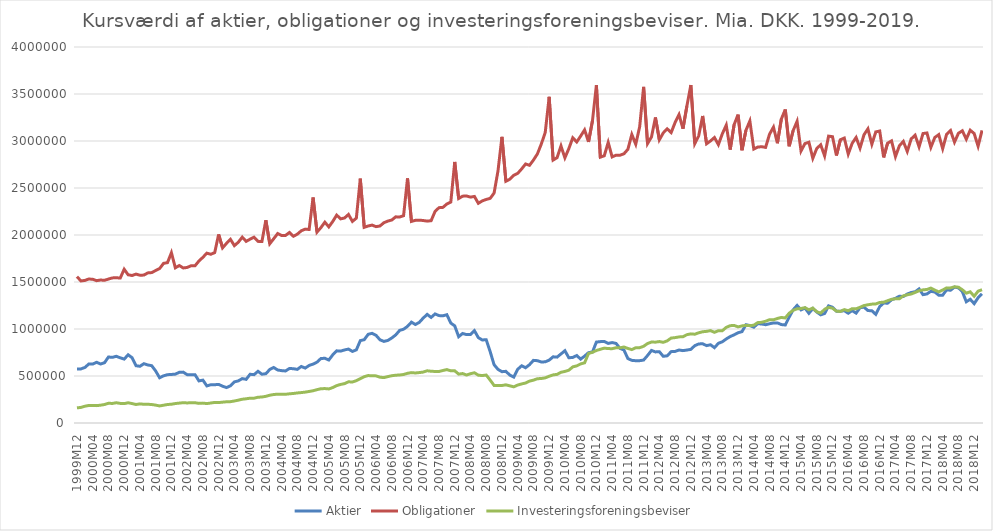
| Category | Aktier | Obligationer | Investeringsforeningsbeviser |
|---|---|---|---|
| 1999M12 | 575174 | 1557344 | 160748 |
| 2000M01 | 575647 | 1511391 | 165778 |
| 2000M02 | 590162 | 1516681 | 178351 |
| 2000M03 | 627205 | 1531792 | 186450 |
| 2000M04 | 627098 | 1528959 | 185941 |
| 2000M05 | 645738 | 1514125 | 184746 |
| 2000M06 | 627336 | 1521104 | 189451 |
| 2000M07 | 641242 | 1517881 | 196711 |
| 2000M08 | 702030 | 1531576 | 209725 |
| 2000M09 | 698497 | 1543590 | 208058 |
| 2000M10 | 709608 | 1545110 | 215514 |
| 2000M11 | 693340 | 1542126 | 208436 |
| 2000M12 | 679721 | 1635693 | 206347 |
| 2001M01 | 725587 | 1576917 | 214998 |
| 2001M02 | 694857 | 1569066 | 206745 |
| 2001M03 | 609401 | 1583968 | 196955 |
| 2001M04 | 603191 | 1572117 | 203492 |
| 2001M05 | 630929 | 1573534 | 198988 |
| 2001M06 | 617507 | 1596730 | 199211 |
| 2001M07 | 609553 | 1600137 | 196654 |
| 2001M08 | 553257 | 1622133 | 190230 |
| 2001M09 | 481246 | 1642834 | 181861 |
| 2001M10 | 501680 | 1698473 | 188909 |
| 2001M11 | 513948 | 1705760 | 196822 |
| 2001M12 | 516411 | 1811508 | 199644 |
| 2002M01 | 519822 | 1650899 | 207163 |
| 2002M02 | 539138 | 1675130 | 211558 |
| 2002M03 | 541132 | 1649367 | 216023 |
| 2002M04 | 514315 | 1654759 | 213580 |
| 2002M05 | 513817 | 1672767 | 215308 |
| 2002M06 | 513817 | 1672767 | 215308 |
| 2002M07 | 447539 | 1723382 | 208760 |
| 2002M08 | 456303 | 1762651 | 211579 |
| 2002M09 | 394395 | 1806730 | 206568 |
| 2002M10 | 406663 | 1795063 | 212548 |
| 2002M11 | 407258 | 1812469 | 219093 |
| 2002M12 | 410511 | 2006227 | 217309 |
| 2003M01 | 391549 | 1863047 | 221673 |
| 2003M02 | 376802 | 1911051 | 225702 |
| 2003M03 | 395690 | 1954134 | 227024 |
| 2003M04 | 437489 | 1886932 | 234152 |
| 2003M05 | 448094 | 1922970 | 242874 |
| 2003M06 | 472372 | 1977111 | 253018 |
| 2003M07 | 464487 | 1932479 | 257571 |
| 2003M08 | 518497 | 1955701 | 264121 |
| 2003M09 | 514394 | 1976613 | 263728 |
| 2003M10 | 549719 | 1932259 | 274176 |
| 2003M11 | 518793 | 1930731 | 276357 |
| 2003M12 | 524264 | 2157438 | 283847 |
| 2004M01 | 569517 | 1907331 | 295540 |
| 2004M02 | 590348 | 1960377 | 302996 |
| 2004M03 | 563873 | 2015258 | 306728 |
| 2004M04 | 557087 | 1994459 | 304884 |
| 2004M05 | 553644 | 1995813 | 305509 |
| 2004M06 | 579982 | 2026560 | 310671 |
| 2004M07 | 577582 | 1986508 | 314125 |
| 2004M08 | 570687 | 2008771 | 319660 |
| 2004M09 | 601262 | 2044870 | 323707 |
| 2004M10 | 584594 | 2062475 | 328383 |
| 2004M11 | 612471 | 2058625 | 335384 |
| 2004M12 | 626287 | 2399007 | 343144 |
| 2005M01 | 647568 | 2030789 | 354733 |
| 2005M02 | 686066 | 2079000 | 364640 |
| 2005M03 | 688607 | 2136473 | 366253 |
| 2005M04 | 670048 | 2086332 | 362498 |
| 2005M05 | 725046 | 2143882 | 376826 |
| 2005M06 | 767618 | 2211582 | 397766 |
| 2005M07 | 764645 | 2171839 | 410469 |
| 2005M08 | 777319 | 2181082 | 418972 |
| 2005M09 | 786332 | 2218467 | 438329 |
| 2005M10 | 761261 | 2144434 | 436105 |
| 2005M11 | 777998 | 2179472 | 450288 |
| 2005M12 | 876163 | 2599662 | 471850 |
| 2006M01 | 886363 | 2081826 | 492881 |
| 2006M02 | 943407 | 2096086 | 504632 |
| 2006M03 | 953835 | 2105200 | 502265 |
| 2006M04 | 932787 | 2088709 | 501263 |
| 2006M05 | 885160 | 2096140 | 487065 |
| 2006M06 | 868076 | 2130715 | 482889 |
| 2006M07 | 878239 | 2147943 | 493746 |
| 2006M08 | 904551 | 2159636 | 503033 |
| 2006M09 | 936797 | 2193171 | 508286 |
| 2006M10 | 984872 | 2191238 | 510813 |
| 2006M11 | 997962 | 2205316 | 516009 |
| 2006M12 | 1027930 | 2602178 | 528614 |
| 2007M01 | 1072939 | 2144428 | 535917 |
| 2007M02 | 1047612 | 2156160 | 532186 |
| 2007M03 | 1070763 | 2158080 | 536508 |
| 2007M04 | 1116896 | 2153997 | 541713 |
| 2007M05 | 1155385 | 2147554 | 555614 |
| 2007M06 | 1123217 | 2152316 | 550464 |
| 2007M07 | 1160422 | 2250769 | 548335 |
| 2007M08 | 1142552 | 2290712 | 547958 |
| 2007M09 | 1140519 | 2293926 | 558609 |
| 2007M10 | 1151802 | 2330081 | 568203 |
| 2007M11 | 1063171 | 2350492 | 555042 |
| 2007M12 | 1033177 | 2777086 | 555003 |
| 2008M01 | 918225 | 2388301 | 520054 |
| 2008M02 | 952377 | 2413171 | 526022 |
| 2008M03 | 940197 | 2415065 | 510069 |
| 2008M04 | 941535 | 2403112 | 524526 |
| 2008M05 | 982089 | 2410140 | 534425 |
| 2008M06 | 908343 | 2337160 | 508793 |
| 2008M07 | 883307 | 2362838 | 504650 |
| 2008M08 | 886096 | 2378275 | 510319 |
| 2008M09 | 759950 | 2389665 | 456584 |
| 2008M10 | 620008 | 2445823 | 399629 |
| 2008M11 | 570116 | 2683893 | 397576 |
| 2008M12 | 545871 | 3044262 | 398958 |
| 2009M01 | 549715 | 2571659 | 405919 |
| 2009M02 | 509245 | 2593509 | 395518 |
| 2009M03 | 488425 | 2634439 | 384809 |
| 2009M04 | 571307 | 2655599 | 403575 |
| 2009M05 | 608507 | 2702649 | 415678 |
| 2009M06 | 587808 | 2755471 | 425281 |
| 2009M07 | 620395 | 2741454 | 445444 |
| 2009M08 | 666249 | 2797081 | 455808 |
| 2009M09 | 662900 | 2862025 | 471255 |
| 2009M10 | 649205 | 2967408 | 473076 |
| 2009M11 | 650795 | 3091417 | 480443 |
| 2009M12 | 668987 | 3470399 | 497313 |
| 2010M01 | 704145 | 2797013 | 511840 |
| 2010M02 | 700775 | 2822479 | 517108 |
| 2010M03 | 734573 | 2947573 | 539561 |
| 2010M04 | 768999 | 2821624 | 548623 |
| 2010M05 | 693852 | 2919512 | 561939 |
| 2010M06 | 697532 | 3034452 | 597185 |
| 2010M07 | 717785 | 2989715 | 607574 |
| 2010M08 | 679719 | 3052346 | 628490 |
| 2010M09 | 711815 | 3118357 | 640203 |
| 2010M10 | 748166 | 2990379 | 739615 |
| 2010M11 | 755357 | 3214863 | 752164 |
| 2010M12 | 860927 | 3594134 | 771586 |
| 2011M01 | 865634 | 2827974 | 784306 |
| 2011M02 | 868103 | 2842919 | 796417 |
| 2011M03 | 846852 | 2985437 | 791657 |
| 2011M04 | 855641 | 2831028 | 790599 |
| 2011M05 | 846467 | 2849098 | 800536 |
| 2011M06 | 793880 | 2848803 | 799381 |
| 2011M07 | 776121 | 2864109 | 808539 |
| 2011M08 | 685664 | 2911356 | 793058 |
| 2011M09 | 666474 | 3069425 | 781106 |
| 2011M10 | 662567 | 2965332 | 800475 |
| 2011M11 | 663050 | 3152146 | 801234 |
| 2011M12 | 669523 | 3576010 | 816113 |
| 2012M01 | 718139 | 2973050 | 845524 |
| 2012M02 | 771891 | 3043339 | 861101 |
| 2012M03 | 756309 | 3250779 | 860080 |
| 2012M04 | 758267 | 3012721 | 866469 |
| 2012M05 | 709421 | 3086802 | 858201 |
| 2012M06 | 715047 | 3129053 | 874065 |
| 2012M07 | 759130 | 3089635 | 903626 |
| 2012M08 | 761567 | 3196643 | 908313 |
| 2012M09 | 776340 | 3280142 | 915947 |
| 2012M10 | 769931 | 3130351 | 918047 |
| 2012M11 | 776180 | 3372924 | 939726 |
| 2012M12 | 783027 | 3594865 | 948097 |
| 2013M01 | 822643 | 2971794 | 944493 |
| 2013M02 | 840966 | 3055002 | 959815 |
| 2013M03 | 843061 | 3266687 | 970768 |
| 2013M04 | 823083 | 2970608 | 974951 |
| 2013M05 | 832404 | 3000721 | 982733 |
| 2013M06 | 801438 | 3037018 | 964751 |
| 2013M07 | 847509 | 2961347 | 981962 |
| 2013M08 | 864162 | 3076403 | 981785 |
| 2013M09 | 894095 | 3168318 | 1017385 |
| 2013M10 | 919727 | 2908692 | 1035193 |
| 2013M11 | 938002 | 3173965 | 1038076 |
| 2013M12 | 960100 | 3280446 | 1022521 |
| 2014M01 | 972051 | 2901676 | 1033038 |
| 2014M02 | 1045250 | 3113336 | 1038806 |
| 2014M03 | 1036700 | 3212970 | 1035572 |
| 2014M04 | 1019324 | 2913924 | 1040537 |
| 2014M05 | 1056345 | 2935294 | 1067899 |
| 2014M06 | 1053268 | 2939289 | 1071309 |
| 2014M07 | 1045577 | 2931923 | 1082399 |
| 2014M08 | 1055727 | 3072485 | 1099020 |
| 2014M09 | 1064387 | 3147346 | 1097512 |
| 2014M10 | 1065062 | 2976149 | 1112138 |
| 2014M11 | 1047105 | 3233681 | 1122770 |
| 2014M12 | 1042846 | 3335104 | 1117579 |
| 2015M01 | 1127106 | 2944162 | 1168416 |
| 2015M02 | 1204008 | 3110563 | 1198616 |
| 2015M03 | 1250650 | 3209223 | 1214989 |
| 2015M04 | 1203383 | 2893858 | 1217483 |
| 2015M05 | 1222973 | 2972672 | 1227671 |
| 2015M06 | 1167167 | 2987107 | 1204045 |
| 2015M07 | 1217273 | 2816092 | 1222869 |
| 2015M08 | 1180886 | 2920478 | 1183209 |
| 2015M09 | 1150968 | 2959819 | 1168840 |
| 2015M10 | 1164772 | 2840932 | 1209796 |
| 2015M11 | 1246261 | 3051786 | 1230392 |
| 2015M12 | 1231384 | 3045899 | 1221305 |
| 2016M01 | 1189395 | 2845990 | 1190360 |
| 2016M02 | 1188901 | 3013158 | 1186317 |
| 2016M03 | 1194812 | 3031239 | 1206339 |
| 2016M04 | 1167867 | 2860692 | 1194605 |
| 2016M05 | 1195364 | 2975857 | 1216550 |
| 2016M06 | 1169180 | 3037508 | 1214723 |
| 2016M07 | 1226644 | 2924713 | 1230825 |
| 2016M08 | 1232244 | 3066071 | 1249459 |
| 2016M09 | 1196029 | 3129698 | 1257885 |
| 2016M10 | 1194275 | 2965309 | 1264519 |
| 2016M11 | 1155665 | 3096966 | 1266793 |
| 2016M12 | 1238726 | 3106073 | 1282391 |
| 2017M01 | 1276151 | 2825485 | 1284932 |
| 2017M02 | 1274516 | 2976695 | 1300925 |
| 2017M03 | 1310623 | 3001150 | 1315199 |
| 2017M04 | 1326559 | 2833825 | 1321766 |
| 2017M05 | 1348626 | 2949494 | 1321655 |
| 2017M06 | 1345559 | 2995667 | 1352616 |
| 2017M07 | 1372048 | 2888799 | 1363987 |
| 2017M08 | 1388313 | 3022612 | 1372419 |
| 2017M09 | 1395875 | 3061858 | 1388975 |
| 2017M10 | 1426668 | 2937368 | 1407208 |
| 2017M11 | 1365481 | 3079521 | 1416370 |
| 2017M12 | 1373026 | 3085511 | 1420427 |
| 2018M01 | 1400754 | 2932511 | 1435535 |
| 2018M02 | 1393182 | 3037546 | 1413678 |
| 2018M03 | 1359679 | 3067714 | 1395253 |
| 2018M04 | 1359881 | 2918565 | 1414464 |
| 2018M05 | 1416915 | 3071595 | 1437468 |
| 2018M06 | 1412144 | 3111266 | 1436857 |
| 2018M07 | 1445580 | 2987774 | 1448938 |
| 2018M08 | 1438113 | 3082261 | 1444653 |
| 2018M09 | 1397169 | 3108896 | 1417390 |
| 2018M10 | 1289904 | 3019030 | 1381145 |
| 2018M11 | 1316352 | 3114899 | 1395533 |
| 2018M12 | 1269704 | 3079542 | 1348423 |
| 2019M01 | 1332607 | 2944927 | 1402513 |
| 2019M02 | 1373999 | 3112791 | 1417913 |